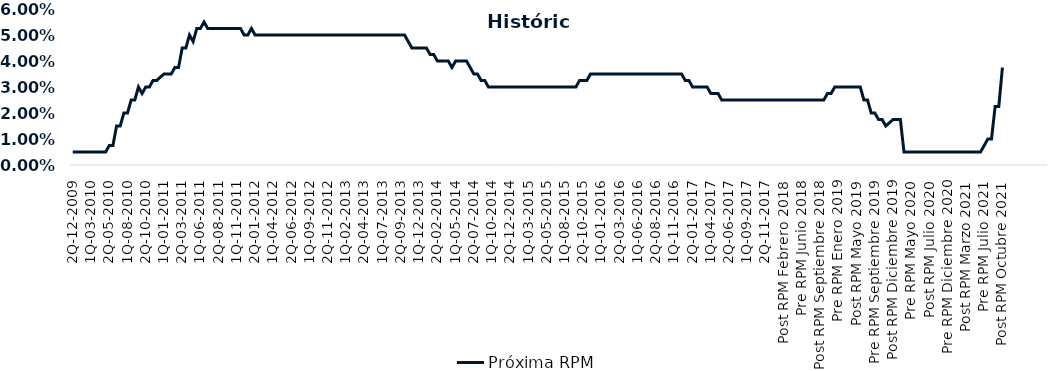
| Category | Próxima RPM |
|---|---|
| 2Q-12-2009 | 0.005 |
| 1Q-01-2010 | 0.005 |
| 2Q-01-2010 | 0.005 |
| 1Q-02-2010 | 0.005 |
| 2Q-02-2010 | 0.005 |
| 1Q-03-2010 | 0.005 |
| 2Q-03-2010 | 0.005 |
| 1Q-04-2010 | 0.005 |
| 2Q-04-2010 | 0.005 |
| 1Q-05-2010 | 0.005 |
| 2Q-05-2010 | 0.008 |
| 1Q-06-2010 | 0.008 |
| 2Q-06-2010 | 0.015 |
| 1Q-07-2010 | 0.015 |
| 2Q-07-2010 | 0.02 |
| 1Q-08-2010 | 0.02 |
| 2Q-08-2010 | 0.025 |
| 1Q-09-2010 | 0.025 |
| 2Q-09-2010 | 0.03 |
| 1Q-10-2010 | 0.028 |
| 2Q-10-2010 | 0.03 |
| 1Q-11-2010 | 0.03 |
| 2Q-11-2010 | 0.032 |
| 1Q-12-2010 | 0.032 |
| 2Q-12-2010 | 0.034 |
| 1Q-01-2011 | 0.035 |
| 2Q-01-2011 | 0.035 |
| 1Q-02-2011 | 0.035 |
| 2Q-02-2011 | 0.038 |
| 1Q-03-2011 | 0.038 |
| 2Q-03-2011 | 0.045 |
| 1Q-04-2011 | 0.045 |
| 2Q-04-2011 | 0.05 |
| 1Q-05-2011 | 0.048 |
| 2Q-05-2011 | 0.052 |
| 1Q-06-2011 | 0.052 |
| 2Q-06-2011 | 0.055 |
| 1Q-07-2011 | 0.052 |
| 2Q-07-2011 | 0.052 |
| 1Q-08-2011 | 0.052 |
| 2Q-08-2011 | 0.052 |
| 1Q-09-2011 | 0.052 |
| 2Q-09-2011 | 0.052 |
| 1Q-10-2011 | 0.052 |
| 2Q-10-2011 | 0.052 |
| 1Q-11-2011 | 0.052 |
| 2Q-11-2011 | 0.052 |
| 1Q-12-2011 | 0.05 |
| 2Q-12-2011 | 0.05 |
| 1Q-01-2012 | 0.052 |
| 2Q-01-2012 | 0.05 |
| 1Q-02-2012 | 0.05 |
| 2Q-02-2012 | 0.05 |
| 1Q-03-2012 | 0.05 |
| 2Q-03-2012 | 0.05 |
| 1Q-04-2012 | 0.05 |
| 2Q-04-2012 | 0.05 |
| 1Q-05-2012 | 0.05 |
| 2Q-05-2012 | 0.05 |
| 1Q-06-2012 | 0.05 |
| 2Q-06-2012 | 0.05 |
| 1Q-07-2012 | 0.05 |
| 2Q-07-2012 | 0.05 |
| 1Q-08-2012 | 0.05 |
| 2Q-08-2012 | 0.05 |
| 1Q-09-2012 | 0.05 |
| 2Q-09-2012 | 0.05 |
| 1Q-10-2012 | 0.05 |
| 2Q-10-2012 | 0.05 |
| 1Q-11-2012 | 0.05 |
| 2Q-11-2012 | 0.05 |
| 1Q-12-2012 | 0.05 |
| 2Q-12-2012 | 0.05 |
| 1Q-01-2013 | 0.05 |
| 2Q-01-2013 | 0.05 |
| 1Q-02-2013 | 0.05 |
| 2Q-02-2013 | 0.05 |
| 1Q-03-2013 | 0.05 |
| 2Q-03-2013 | 0.05 |
| 1Q-04-2013 | 0.05 |
| 2Q-04-2013 | 0.05 |
| 1Q-05-2013 | 0.05 |
| 2Q-05-2013 | 0.05 |
| 1Q-06-2013 | 0.05 |
| 2Q-06-2013 | 0.05 |
| 1Q-07-2013 | 0.05 |
| 2Q-07-2013 | 0.05 |
| 1Q-08-2013 | 0.05 |
| 2Q-08-2013 | 0.05 |
| 1Q-09-2013 | 0.05 |
| 2Q-09-2013 | 0.05 |
| 1Q-10-2013 | 0.05 |
| 2Q-10-2013 | 0.048 |
| 1Q-11-2013 | 0.045 |
| 2Q-11-2013 | 0.045 |
| 1Q-12-2013 | 0.045 |
| 2Q-12-2013 | 0.045 |
| 1Q-01-2014 | 0.045 |
| 2Q-01-2014 | 0.042 |
| 1Q-02-2014 | 0.042 |
| 2Q-02-2014 | 0.04 |
| 1Q-03-2014 | 0.04 |
| 2Q-03-2014 | 0.04 |
| 1Q-04-2014 | 0.04 |
| 2Q-04-2014 | 0.038 |
| 1Q-05-2014 | 0.04 |
| 2Q-05-2014 | 0.04 |
| 1Q-06-2014 | 0.04 |
| 2Q-06-2014 | 0.04 |
| 1Q-07-2014 | 0.038 |
| 2Q-07-2014 | 0.035 |
| 1Q-08-2014 | 0.035 |
| 2Q-08-2014 | 0.032 |
| 1Q-09-2014 | 0.032 |
| 2Q-09-2014 | 0.03 |
| 1Q-10-2014 | 0.03 |
| 2Q-10-2014 | 0.03 |
| 1Q-11-2014 | 0.03 |
| 2Q-11-2014 | 0.03 |
| 1Q-12-2014 | 0.03 |
| 2Q-12-2014 | 0.03 |
| 1Q-01-2015 | 0.03 |
| 2Q-01-2015 | 0.03 |
| 1Q-02-2015 | 0.03 |
| 2Q-02-2015 | 0.03 |
| 1Q-03-2015 | 0.03 |
| 2Q-03-2015 | 0.03 |
| 1Q-04-2015 | 0.03 |
| 2Q-04-2015 | 0.03 |
| 1Q-05-2015 | 0.03 |
| 2Q-05-2015 | 0.03 |
| 1Q-06-2015 | 0.03 |
| 2Q-06-2015 | 0.03 |
| 1Q-07-2015 | 0.03 |
| 2Q-07-2015 | 0.03 |
| 1Q-08-2015 | 0.03 |
| 2Q-08-2015 | 0.03 |
| 1Q-09-2015 | 0.03 |
| 2Q-09-2015 | 0.03 |
| 1Q-10-2015 | 0.032 |
| 2Q-10-2015 | 0.032 |
| 1Q-11-2015 | 0.032 |
| 2Q-11-2015 | 0.035 |
| 1Q-12-2015 | 0.035 |
| 2Q-12-2015 | 0.035 |
| 1Q-01-2016 | 0.035 |
| 2Q-01-2016 | 0.035 |
| 1Q-02-2016 | 0.035 |
| 2Q-02-2016 | 0.035 |
| 1Q-03-2016 | 0.035 |
| 2Q-03-2016 | 0.035 |
| 1Q-04-2016 | 0.035 |
| 2Q-04-2016 | 0.035 |
| 1Q-05-2016 | 0.035 |
| 2Q-05-2016 | 0.035 |
| 1Q-06-2016 | 0.035 |
| 2Q-06-2016 | 0.035 |
| 1Q-07-2016 | 0.035 |
| 2Q-07-2016 | 0.035 |
| 1Q-08-2016 | 0.035 |
| 2Q-08-2016 | 0.035 |
| 1Q-09-2016 | 0.035 |
| 2Q-09-2016 | 0.035 |
| 1Q-10-2016 | 0.035 |
| 2Q-10-2016 | 0.035 |
| 1Q-11-2016 | 0.035 |
| 2Q-11-2016 | 0.035 |
| 1Q-12-2016 | 0.035 |
| 2Q-12-2016 | 0.032 |
| 1Q-01-2017 | 0.032 |
| 2Q-01-2017 | 0.03 |
| 1Q-02-2017 | 0.03 |
| 2Q-02-2017 | 0.03 |
| 1Q-03-2017 | 0.03 |
| 2Q-03-2017 | 0.03 |
| 1Q-04-2017 | 0.028 |
| 2Q-04-2017 | 0.028 |
| 1Q-05-2017 | 0.028 |
| 2Q-05-2017 | 0.025 |
| 1Q-06-2017 | 0.025 |
| 2Q-06-2017 | 0.025 |
| 1Q-07-2017 | 0.025 |
| 2Q-07-2017 | 0.025 |
| 1Q-08-2017 | 0.025 |
| 2Q-08-2017 | 0.025 |
| 1Q-09-2017 | 0.025 |
| 2Q-09-2017 | 0.025 |
| 1Q-10-2017 | 0.025 |
| 2Q-10-2017 | 0.025 |
| 1Q-11-2017 | 0.025 |
| 2Q-11-2017 | 0.025 |
| 1Q-12-2017 | 0.025 |
| 2Q-12-2017 | 0.025 |
| 1Q-01-2018 | 0.025 |
| 2Q-01-2018 | 0.025 |
| Post RPM Febrero 2018 | 0.025 |
| Pre RPM Marzo 2018 | 0.025 |
| Post RPM Marzo 2018 | 0.025 |
| Pre RPM Mayo 2018 | 0.025 |
| Post RPM Mayo 2018 | 0.025 |
| Pre RPM Junio 2018 | 0.025 |
| Post RPM Junio 2018 | 0.025 |
| Pre RPM Julio 2018 | 0.025 |
| Post RPM Julio 2018 | 0.025 |
| Pre RPM Septiembre 2018 | 0.025 |
| Post RPM Septiembre 2018 | 0.025 |
| Pre RPM Octubre 2018 | 0.025 |
| Post RPM Octubre 2018 | 0.028 |
| Pre RPM Diciembre 2018 | 0.028 |
| Post RPM Diciembre 2018 | 0.03 |
| Pre RPM Enero 2019 | 0.03 |
| Post RPM Enero 2019 | 0.03 |
| Pre RPM Marzo 2019 | 0.03 |
| Post RPM Marzo 2019 | 0.03 |
| Pre RPM Mayo 2019 | 0.03 |
| Post RPM Mayo 2019 | 0.03 |
| Pre RPM Junio 2019 | 0.03 |
| Post RPM Junio 2019 | 0.025 |
| Pre RPM Julio 2019 | 0.025 |
| Post RPM Julio 2019 | 0.02 |
| Pre RPM Septiembre 2019 | 0.02 |
| Post RPM Septiembre 2019 | 0.018 |
| Pre RPM Octubre 2019 | 0.018 |
| Post RPM Octubre 2019 | 0.015 |
| Pre RPM Diciembre 2019 | 0.016 |
| Post RPM Diciembre 2019 | 0.018 |
| Pre RPM Enero 2020 | 0.018 |
| Post RPM Enero 2020 | 0.018 |
| Pre RPM Marzo 2020 | 0.005 |
| Post RPM Marzo 2020 | 0.005 |
| Pre RPM Mayo 2020 | 0.005 |
| Post RPM Mayo 2020 | 0.005 |
| Pre RPM Junio 2020 | 0.005 |
| Post RPM Junio 2020 | 0.005 |
| Pre RPM Julio 2020 | 0.005 |
| Post RPM Julio 2020 | 0.005 |
| Pre RPM Septiembre 2020 | 0.005 |
| Post RPM Septiembre 2020 | 0.005 |
| Pre RPM Octubre 2020 | 0.005 |
| Post RPM Octubre 2020 | 0.005 |
| Pre RPM Diciembre 2020 | 0.005 |
| Post RPM Diciembre 2020 | 0.005 |
| Pre RPM Enero 2021 | 0.005 |
| Post RPM Enero 2021 | 0.005 |
| Pre RPM Marzo 2021 | 0.005 |
| Post RPM Marzo 2021 | 0.005 |
| Pre RPM Mayo 2021 | 0.005 |
| Post RPM Mayo 2021 | 0.005 |
| Pre RPM Junio 2021 | 0.005 |
| Post RPM Junio 2021 | 0.005 |
| Pre RPM Julio 2021 | 0.008 |
| Post RPM Julio 2021 | 0.01 |
| Pre RPM Agosto 2021 | 0.01 |
| Post RPM Agosto 2021 | 0.022 |
| Pre RPM Octubre 2021 | 0.022 |
| Post RPM Octubre 2021 | 0.038 |